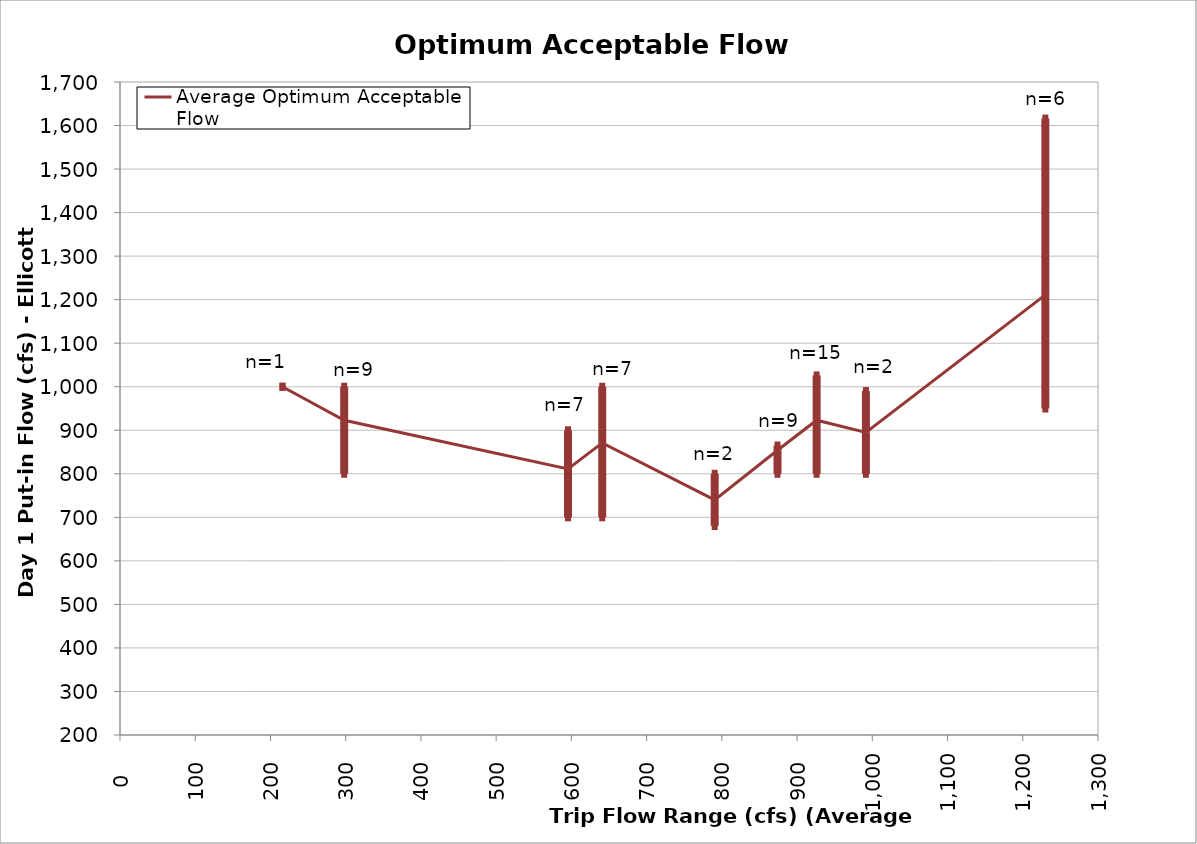
| Category | Average Optimum Acceptable Flow |
|---|---|
| 216.0 | 1000 |
| 298.0 | 923 |
| 595.5 | 811 |
| 641.0 | 871 |
| 790.5 | 740 |
| 874.0 | 854 |
| 926.0 | 923 |
| 991.5 | 895 |
| 1230.0 | 1211 |